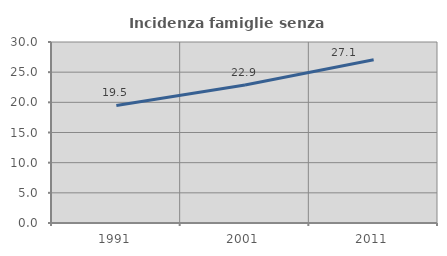
| Category | Incidenza famiglie senza nuclei |
|---|---|
| 1991.0 | 19.484 |
| 2001.0 | 22.863 |
| 2011.0 | 27.065 |